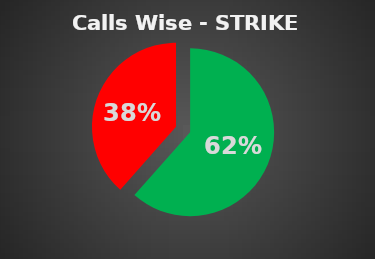
| Category | Series 0 |
|---|---|
| 0 | 0.615 |
| 1 | 0.385 |